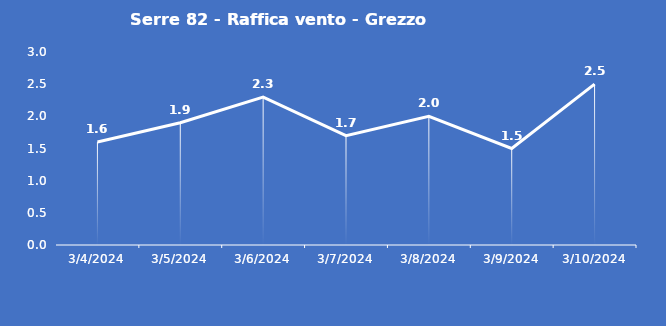
| Category | Serre 82 - Raffica vento - Grezzo (m/s) |
|---|---|
| 3/4/24 | 1.6 |
| 3/5/24 | 1.9 |
| 3/6/24 | 2.3 |
| 3/7/24 | 1.7 |
| 3/8/24 | 2 |
| 3/9/24 | 1.5 |
| 3/10/24 | 2.5 |